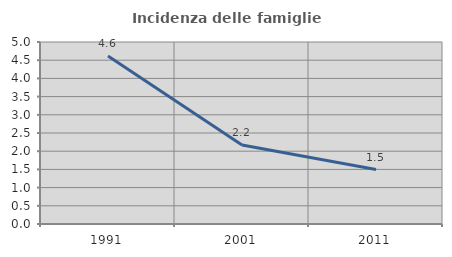
| Category | Incidenza delle famiglie numerose |
|---|---|
| 1991.0 | 4.615 |
| 2001.0 | 2.172 |
| 2011.0 | 1.496 |